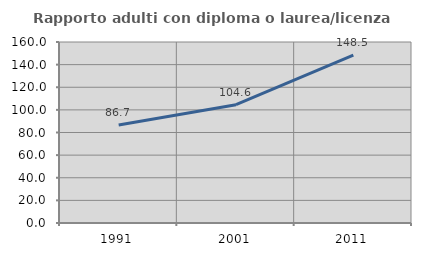
| Category | Rapporto adulti con diploma o laurea/licenza media  |
|---|---|
| 1991.0 | 86.667 |
| 2001.0 | 104.567 |
| 2011.0 | 148.467 |